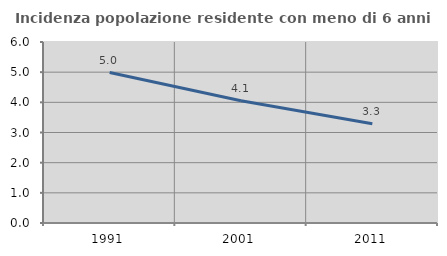
| Category | Incidenza popolazione residente con meno di 6 anni |
|---|---|
| 1991.0 | 4.987 |
| 2001.0 | 4.054 |
| 2011.0 | 3.293 |